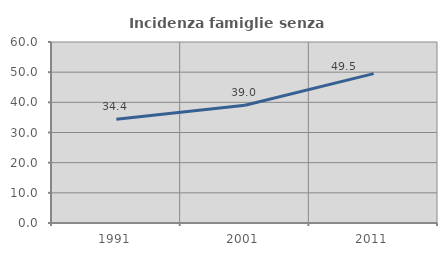
| Category | Incidenza famiglie senza nuclei |
|---|---|
| 1991.0 | 34.4 |
| 2001.0 | 39.007 |
| 2011.0 | 49.524 |